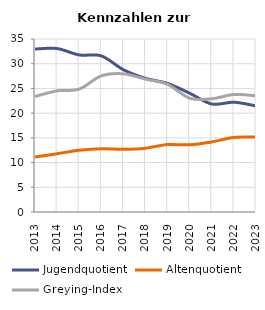
| Category | Jugendquotient | Altenquotient | Greying-Index |
|---|---|---|---|
| 2013.0 | 32.965 | 11.137 | 23.368 |
| 2014.0 | 33.068 | 11.801 | 24.51 |
| 2015.0 | 31.775 | 12.494 | 24.86 |
| 2016.0 | 31.587 | 12.81 | 27.547 |
| 2017.0 | 28.78 | 12.71 | 27.957 |
| 2018.0 | 27.041 | 12.92 | 26.878 |
| 2019.0 | 26.006 | 13.649 | 25.816 |
| 2020.0 | 24.03 | 13.6 | 23.02 |
| 2021.0 | 21.851 | 14.184 | 22.906 |
| 2022.0 | 22.21 | 15.08 | 23.78 |
| 2023.0 | 21.459 | 15.153 | 23.495 |